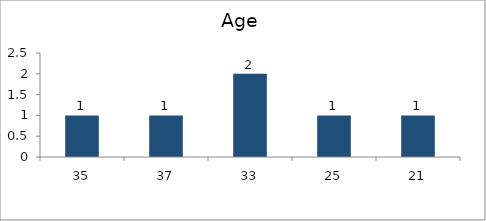
| Category | Age |
|---|---|
| 35.0 | 1 |
| 37.0 | 1 |
| 33.0 | 2 |
| 25.0 | 1 |
| 21.0 | 1 |